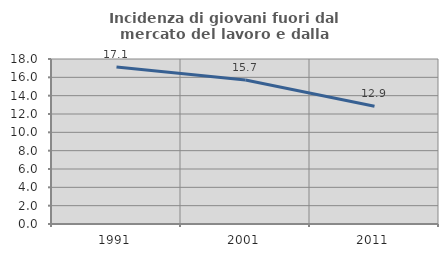
| Category | Incidenza di giovani fuori dal mercato del lavoro e dalla formazione  |
|---|---|
| 1991.0 | 17.129 |
| 2001.0 | 15.701 |
| 2011.0 | 12.852 |